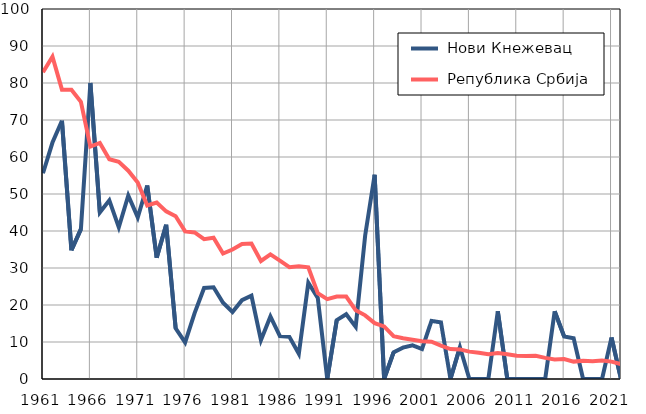
| Category |  Нови Кнежевац |  Република Србија |
|---|---|---|
| 1961.0 | 55.6 | 82.9 |
| 1962.0 | 63.9 | 87.1 |
| 1963.0 | 69.8 | 78.2 |
| 1964.0 | 34.8 | 78.2 |
| 1965.0 | 40.5 | 74.9 |
| 1966.0 | 80 | 62.8 |
| 1967.0 | 45 | 63.8 |
| 1968.0 | 48.3 | 59.4 |
| 1969.0 | 41 | 58.7 |
| 1970.0 | 49.6 | 56.3 |
| 1971.0 | 43.7 | 53.1 |
| 1972.0 | 52.3 | 46.9 |
| 1973.0 | 32.8 | 47.7 |
| 1974.0 | 41.7 | 45.3 |
| 1975.0 | 13.7 | 44 |
| 1976.0 | 9.9 | 39.9 |
| 1977.0 | 17.8 | 39.6 |
| 1978.0 | 24.6 | 37.8 |
| 1979.0 | 24.8 | 38.2 |
| 1980.0 | 20.6 | 33.9 |
| 1981.0 | 18.1 | 35 |
| 1982.0 | 21.3 | 36.5 |
| 1983.0 | 22.5 | 36.6 |
| 1984.0 | 10.5 | 31.9 |
| 1985.0 | 16.9 | 33.7 |
| 1986.0 | 11.6 | 32 |
| 1987.0 | 11.4 | 30.2 |
| 1988.0 | 6.8 | 30.5 |
| 1989.0 | 26 | 30.2 |
| 1990.0 | 21.9 | 23.2 |
| 1991.0 | 0 | 21.6 |
| 1992.0 | 15.9 | 22.3 |
| 1993.0 | 17.5 | 22.3 |
| 1994.0 | 14.1 | 18.6 |
| 1995.0 | 38.8 | 17.2 |
| 1996.0 | 55.2 | 15.1 |
| 1997.0 | 0 | 14.2 |
| 1998.0 | 7.2 | 11.6 |
| 1999.0 | 8.5 | 11 |
| 2000.0 | 9.1 | 10.6 |
| 2001.0 | 8.1 | 10.2 |
| 2002.0 | 15.7 | 10.1 |
| 2003.0 | 15.3 | 9 |
| 2004.0 | 0 | 8.1 |
| 2005.0 | 8.6 | 8 |
| 2006.0 | 0 | 7.4 |
| 2007.0 | 0 | 7.1 |
| 2008.0 | 0 | 6.7 |
| 2009.0 | 18.3 | 7 |
| 2010.0 | 0 | 6.7 |
| 2011.0 | 0 | 6.3 |
| 2012.0 | 0 | 6.2 |
| 2013.0 | 0 | 6.3 |
| 2014.0 | 0 | 5.7 |
| 2015.0 | 18.3 | 5.3 |
| 2016.0 | 11.5 | 5.4 |
| 2017.0 | 11 | 4.7 |
| 2018.0 | 0 | 4.9 |
| 2019.0 | 0 | 4.8 |
| 2020.0 | 0 | 5 |
| 2021.0 | 11.2 | 4.7 |
| 2022.0 | 0 | 4 |